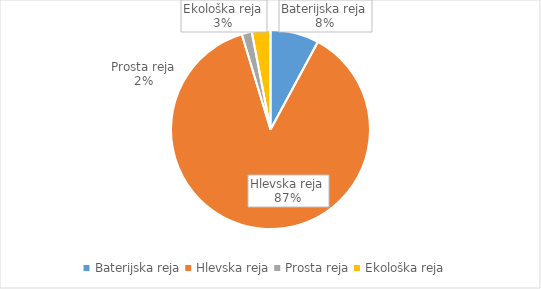
| Category | Količina kosov jajc |
|---|---|
| Baterijska reja | 255533 |
| Hlevska reja | 2833657 |
| Prosta reja | 53162 |
| Ekološka reja | 97920 |